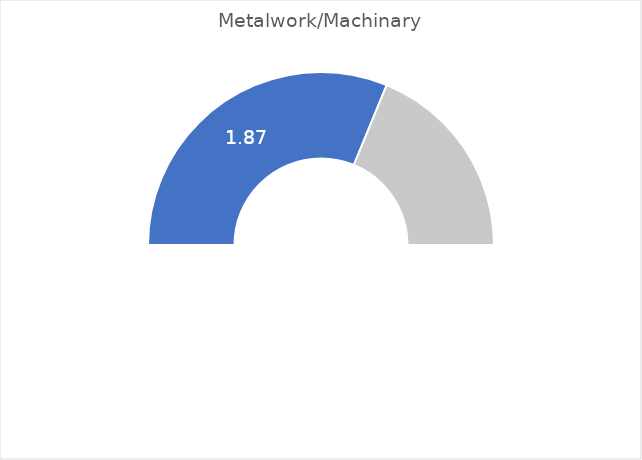
| Category | Series 0 |
|---|---|
| 0 | 0.624 |
| 1 | 0.376 |
| 2 | 1 |